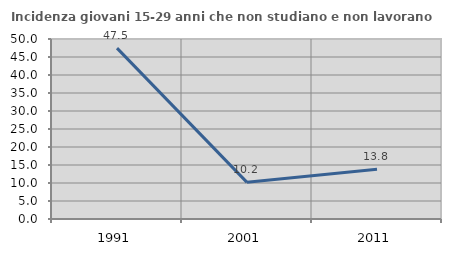
| Category | Incidenza giovani 15-29 anni che non studiano e non lavorano  |
|---|---|
| 1991.0 | 47.464 |
| 2001.0 | 10.181 |
| 2011.0 | 13.8 |